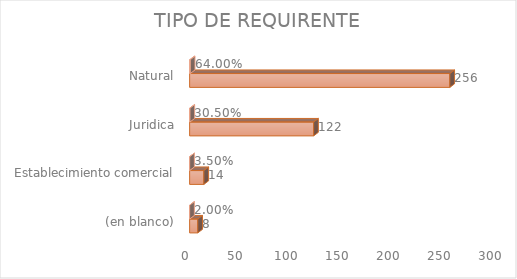
| Category | Cuenta de Número petición | Cuenta de Número petición2 |
|---|---|---|
| (en blanco) | 8 | 0.02 |
| Establecimiento comercial | 14 | 0.035 |
| Juridica | 122 | 0.305 |
| Natural | 256 | 0.64 |